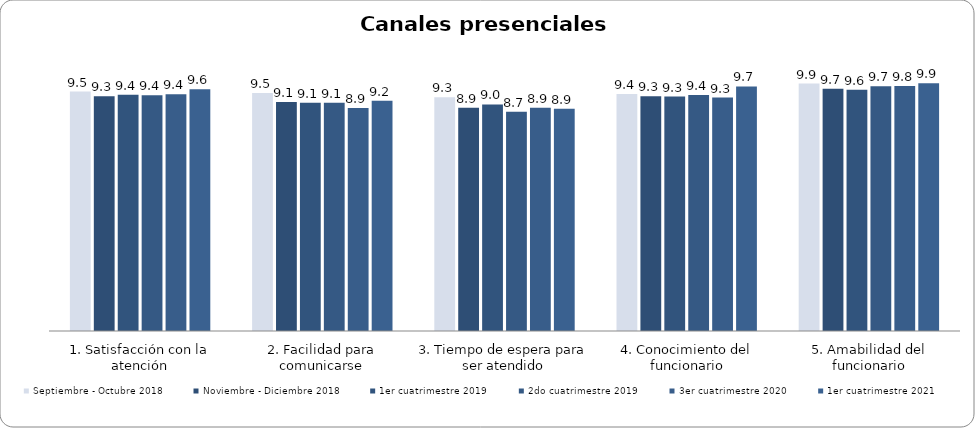
| Category | Septiembre - Octubre 2018 | Noviembre - Diciembre 2018 | 1er cuatrimestre 2019 | 2do cuatrimestre 2019 | 3er cuatrimestre 2020 | 1er cuatrimestre 2021 |
|---|---|---|---|---|---|---|
| 1. Satisfacción con la atención | 9.541 | 9.348 | 9.416 | 9.388 | 9.433 | 9.634 |
| 2. Facilidad para comunicarse | 9.48 | 9.121 | 9.096 | 9.09 | 8.885 | 9.171 |
| 3. Tiempo de espera para ser atendido | 9.316 | 8.894 | 9.024 | 8.731 | 8.894 | 8.854 |
| 4. Conocimiento del funcionario | 9.439 | 9.348 | 9.34 | 9.403 | 9.298 | 9.744 |
| 5. Amabilidad del funcionario | 9.857 | 9.652 | 9.616 | 9.746 | 9.76 | 9.866 |